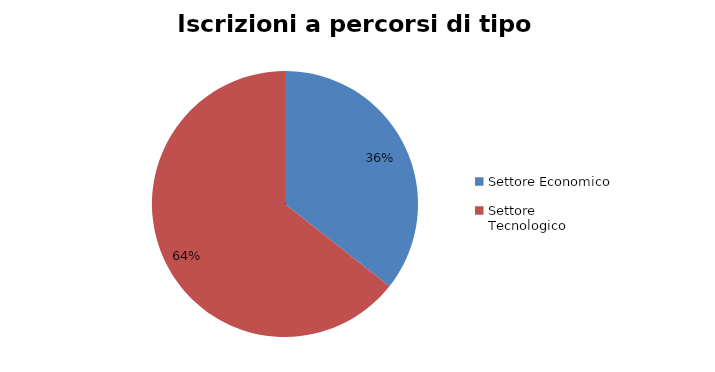
| Category | Series 0 |
|---|---|
| Settore Economico | 4871 |
| Settore Tecnologico | 8800 |